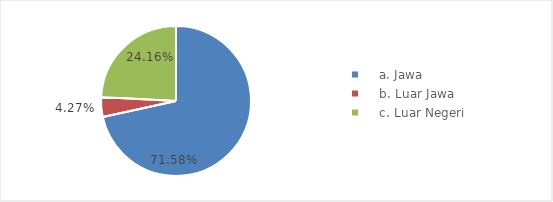
| Category | Series 0 |
|---|---|
|     a. Jawa  | 12469992 |
|     b. Luar Jawa  | 744360 |
|     c. Luar Negeri  | 4208566 |